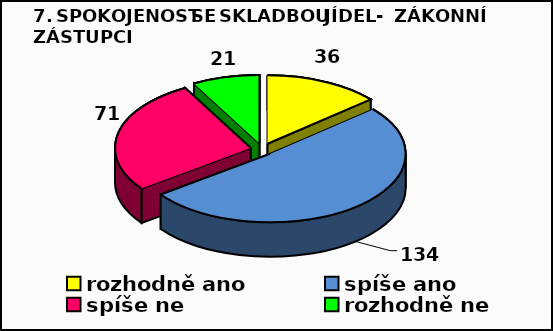
| Category | Series 0 |
|---|---|
| rozhodně ano | 36 |
| spíše ano | 134 |
| spíše ne | 71 |
| rozhodně ne | 21 |